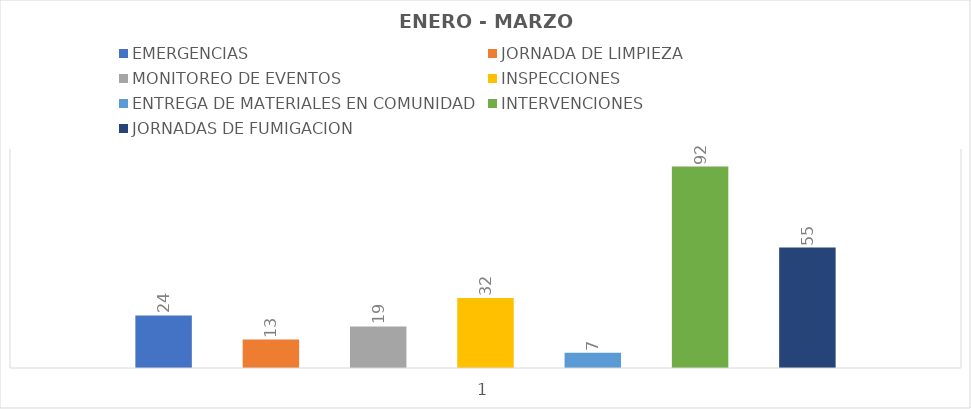
| Category | EMERGENCIAS  | JORNADA DE LIMPIEZA | MONITOREO DE EVENTOS  | INSPECCIONES | ENTREGA DE MATERIALES EN COMUNIDAD | INTERVENCIONES | JORNADAS DE FUMIGACION |
|---|---|---|---|---|---|---|---|
| 0 | 24 | 13 | 19 | 32 | 7 | 92 | 55 |